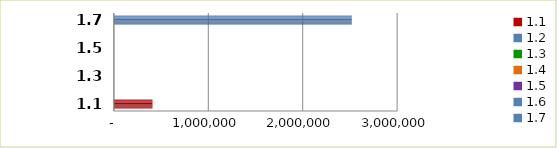
| Category | Series 0 |
|---|---|
| 1.1 | 408649 |
| 1.2 | 0 |
| 1.3 | 0 |
| 1.4 | 0 |
| 1.5 | 0 |
| 1.6 | 0 |
| 1.7 | 2520000 |